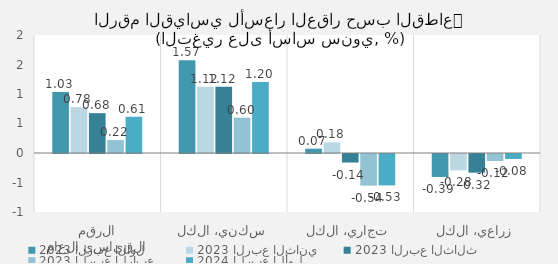
| Category | 2023 | 2024 |
|---|---|---|
| الرقم القياسي العام | 0.219 | 0.615 |
| سكني، الكل | 0.599 | 1.202 |
| تجاري، الكل | -0.536 | -0.532 |
| زراعي، الكل | -0.119 | -0.084 |